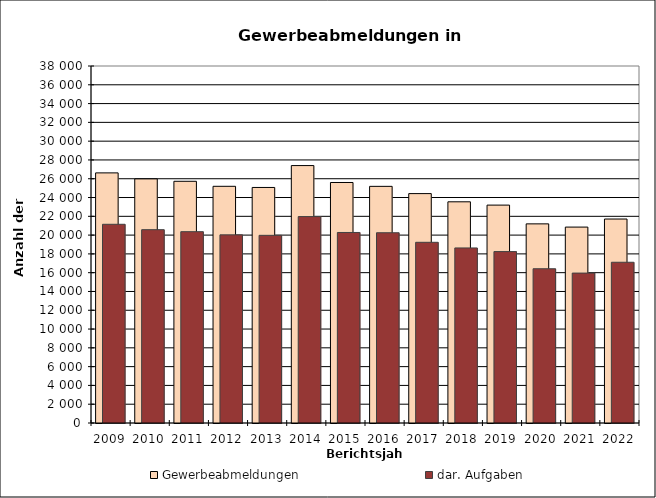
| Category | Gewerbeabmeldungen | dar. Aufgaben |
|---|---|---|
| 2009.0 | 26623 | 21151 |
| 2010.0 | 25984 | 20578 |
| 2011.0 | 25729 | 20364 |
| 2012.0 | 25195 | 20027 |
| 2013.0 | 25071 | 19975 |
| 2014.0 | 27402 | 21971 |
| 2015.0 | 25601 | 20280 |
| 2016.0 | 25189 | 20252 |
| 2017.0 | 24417 | 19234 |
| 2018.0 | 23545 | 18633 |
| 2019.0 | 23193 | 18245 |
| 2020.0 | 21196 | 16419 |
| 2021.0 | 20853 | 15957 |
| 2022.0 | 21711 | 17109 |